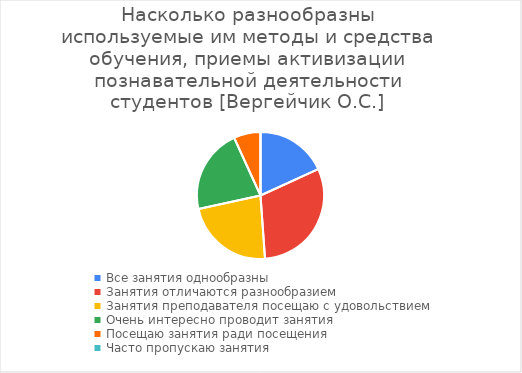
| Category | Series 0 |
|---|---|
| Все занятия однообразны | 16 |
| Занятия отличаются разнообразием | 27 |
| Занятия преподавателя посещаю с удовольствием | 20 |
| Очень интересно проводит занятия | 19 |
| Посещаю занятия ради посещения | 6 |
| Часто пропускаю занятия | 0 |